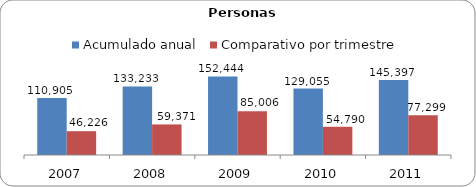
| Category | Acumulado anual | Comparativo por trimestre |
|---|---|---|
| 2007.0 | 110905 | 46226 |
| 2008.0 | 133233 | 59371 |
| 2009.0 | 152444 | 85006 |
| 2010.0 | 129055 | 54790 |
| 2011.0 | 145397 | 77299 |